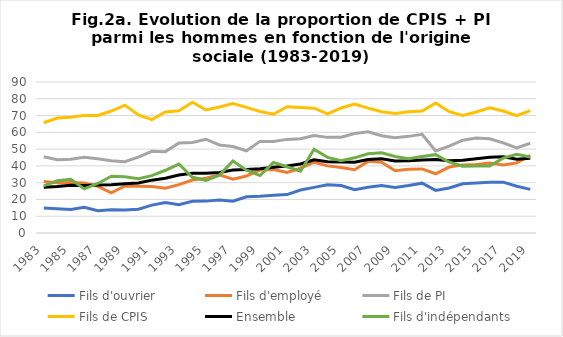
| Category | Fils d'ouvrier | Fils d'employé | Fils de PI | Fils de CPIS | Ensemble | Fils d'indépendants |
|---|---|---|---|---|---|---|
| 1983.0 | 14.9 | 30.7 | 45.5 | 65.7 | 27.3 | 28.1 |
| 1984.0 | 14.5 | 29.9 | 43.7 | 68.5 | 27.7 | 31.1 |
| 1985.0 | 14 | 30.1 | 43.9 | 69 | 28.5 | 32 |
| 1986.0 | 15.3 | 29.8 | 45.2 | 70.1 | 28.3 | 26.3 |
| 1987.0 | 13.3 | 27.8 | 44.2 | 70.1 | 28.6 | 29.5 |
| 1988.0 | 13.8 | 23.9 | 43.1 | 72.7 | 28.7 | 33.8 |
| 1989.0 | 13.7 | 28 | 42.5 | 76.2 | 29.4 | 33.5 |
| 1990.0 | 14.2 | 27.9 | 45.2 | 70.4 | 29.8 | 32.4 |
| 1991.0 | 16.6 | 27.7 | 48.7 | 67.6 | 31.5 | 34.2 |
| 1992.0 | 18.1 | 26.7 | 48.5 | 72.1 | 32.6 | 37.4 |
| 1993.0 | 16.8 | 28.8 | 53.7 | 72.9 | 34.6 | 41.1 |
| 1994.0 | 18.9 | 31.6 | 53.9 | 77.9 | 35.6 | 33.2 |
| 1995.0 | 19 | 32.6 | 55.9 | 73.3 | 35.6 | 31.4 |
| 1996.0 | 19.6 | 34.7 | 52.5 | 75.1 | 36.1 | 34.5 |
| 1997.0 | 18.9 | 32.1 | 51.5 | 77.1 | 37.6 | 42.9 |
| 1998.0 | 21.6 | 34 | 49 | 74.9 | 37.8 | 37.4 |
| 1999.0 | 21.9 | 37.5 | 54.6 | 72.4 | 38.3 | 34.2 |
| 2000.0 | 22.5 | 37.9 | 54.5 | 70.8 | 39.2 | 42.1 |
| 2001.0 | 22.9 | 36.1 | 55.8 | 75.3 | 39.9 | 39.5 |
| 2002.0 | 25.6 | 38.6 | 56.2 | 74.8 | 41.1 | 36.8 |
| 2003.0 | 27.2 | 42.2 | 58.1 | 74.4 | 43.6 | 49.9 |
| 2004.0 | 28.8 | 40 | 57 | 71 | 42.5 | 45.1 |
| 2005.0 | 28.3 | 39 | 57.1 | 74.5 | 42.3 | 43.1 |
| 2006.0 | 25.8 | 37.7 | 59.3 | 76.9 | 42.2 | 44.8 |
| 2007.0 | 27.3 | 42.7 | 60.3 | 74.4 | 43.8 | 47.2 |
| 2008.0 | 28.3 | 42.2 | 58 | 72.3 | 44.3 | 47.8 |
| 2009.0 | 27.1 | 37.1 | 56.8 | 71.3 | 42.9 | 45.6 |
| 2010.0 | 28.3 | 38 | 57.6 | 72.3 | 43.1 | 44.2 |
| 2011.0 | 29.7 | 38.2 | 58.8 | 72.7 | 43.5 | 45.6 |
| 2012.0 | 25.4 | 35.3 | 48.9 | 77.5 | 43.8 | 46.7 |
| 2013.0 | 26.8 | 39.3 | 51.8 | 72.3 | 43.1 | 42.3 |
| 2014.0 | 29.3 | 40.6 | 55.3 | 70.1 | 43.3 | 39.8 |
| 2015.0 | 29.8 | 40.9 | 56.6 | 72.1 | 44.3 | 39.9 |
| 2016.0 | 30.3 | 41.7 | 56.2 | 74.6 | 45.2 | 40 |
| 2017.0 | 30.3 | 40.5 | 53.7 | 72.7 | 45.4 | 44.6 |
| 2018.0 | 27.9 | 41.8 | 50.7 | 70 | 44 | 46.9 |
| 2019.0 | 26 | 46.3 | 53.5 | 72.9 | 44.6 | 45.3 |